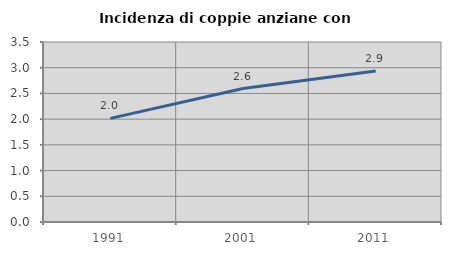
| Category | Incidenza di coppie anziane con figli |
|---|---|
| 1991.0 | 2.015 |
| 2001.0 | 2.596 |
| 2011.0 | 2.936 |